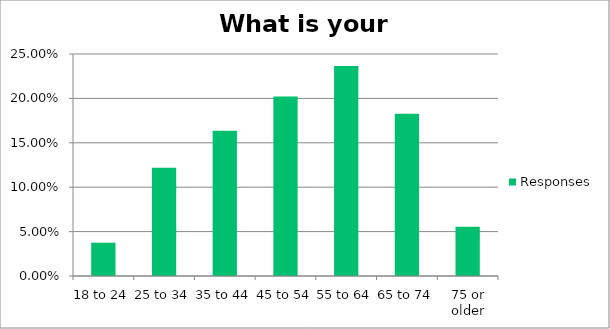
| Category | Responses |
|---|---|
| 18 to 24 | 0.038 |
| 25 to 34 | 0.122 |
| 35 to 44 | 0.164 |
| 45 to 54 | 0.202 |
| 55 to 64 | 0.236 |
| 65 to 74 | 0.183 |
| 75 or older | 0.055 |